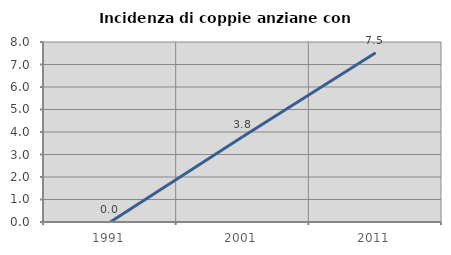
| Category | Incidenza di coppie anziane con figli |
|---|---|
| 1991.0 | 0 |
| 2001.0 | 3.797 |
| 2011.0 | 7.527 |